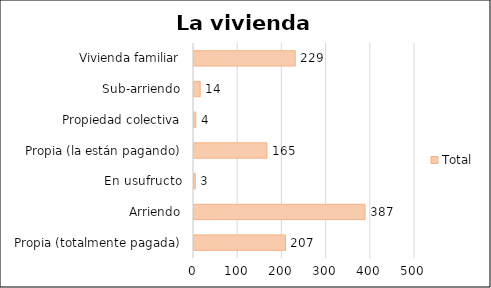
| Category | Total |
|---|---|
|  Propia (totalmente pagada) | 207 |
| Arriendo | 387 |
| En usufructo | 3 |
| Propia (la están pagando) | 165 |
| Propiedad colectiva | 4 |
| Sub-arriendo | 14 |
| Vivienda familiar | 229 |